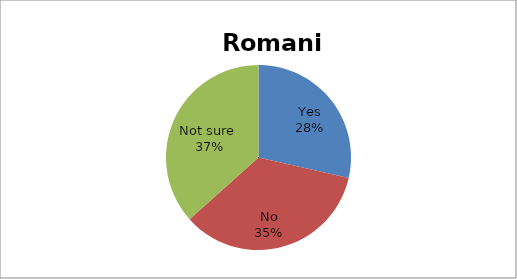
| Category | Series 0 |
|---|---|
| Yes | 32 |
| No | 39 |
| Not sure  | 41 |